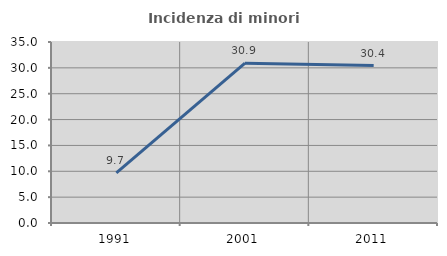
| Category | Incidenza di minori stranieri |
|---|---|
| 1991.0 | 9.677 |
| 2001.0 | 30.894 |
| 2011.0 | 30.443 |